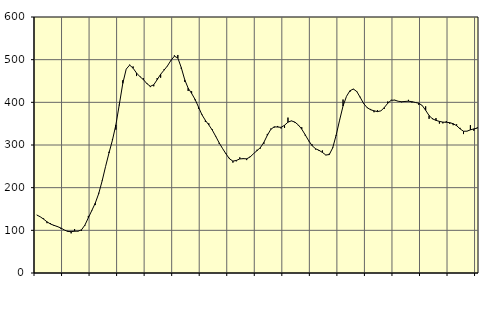
| Category | Piggar | Series 1 |
|---|---|---|
| nan | 136.1 | 135.94 |
| 87.0 | 131.9 | 131.87 |
| 87.0 | 127.9 | 126.28 |
| 87.0 | 116.8 | 119.91 |
| nan | 116.7 | 114.82 |
| 88.0 | 110.3 | 111.72 |
| 88.0 | 110.1 | 108.84 |
| 88.0 | 103.7 | 105.51 |
| nan | 101 | 100.97 |
| 89.0 | 98.9 | 97.38 |
| 89.0 | 92.9 | 96.98 |
| 89.0 | 103.1 | 97.82 |
| nan | 97.5 | 98.11 |
| 90.0 | 98.5 | 101.14 |
| 90.0 | 111.1 | 112.34 |
| 90.0 | 133.8 | 129.44 |
| nan | 147.4 | 146.35 |
| 91.0 | 159.2 | 163.51 |
| 91.0 | 187.8 | 185.89 |
| 91.0 | 216.3 | 215.57 |
| nan | 249.6 | 249.4 |
| 92.0 | 284.1 | 281.43 |
| 92.0 | 314 | 311.37 |
| 92.0 | 336.1 | 347.24 |
| nan | 393 | 394.89 |
| 93.0 | 451.7 | 444.25 |
| 93.0 | 477.9 | 477.86 |
| 93.0 | 488.2 | 487.33 |
| nan | 484.1 | 480.06 |
| 94.0 | 461.6 | 468.66 |
| 94.0 | 461 | 460.13 |
| 94.0 | 456.4 | 453.19 |
| nan | 445.2 | 443.91 |
| 95.0 | 435.7 | 437.53 |
| 95.0 | 437.6 | 441.12 |
| 95.0 | 457 | 453.09 |
| nan | 457.7 | 465.75 |
| 96.0 | 477.5 | 475.47 |
| 96.0 | 484.8 | 485.62 |
| 96.0 | 497.3 | 498.37 |
| nan | 510.1 | 508.2 |
| 97.0 | 511 | 503.9 |
| 97.0 | 478.4 | 481.43 |
| 97.0 | 448.1 | 452.93 |
| nan | 426.6 | 433.16 |
| 98.0 | 426 | 420.98 |
| 98.0 | 405 | 407.01 |
| 98.0 | 384.9 | 389.13 |
| nan | 372.1 | 370.88 |
| 99.0 | 354.1 | 357.81 |
| 99.0 | 350.8 | 347.02 |
| 99.0 | 336.7 | 335.11 |
| nan | 319.5 | 320.44 |
| 0.0 | 303 | 305.16 |
| 0.0 | 291.4 | 291.72 |
| 0.0 | 280.2 | 279.05 |
| nan | 269.7 | 267.75 |
| 1.0 | 258.7 | 262.21 |
| 1.0 | 261.8 | 263.77 |
| 1.0 | 271 | 267.39 |
| nan | 269.2 | 267.92 |
| 2.0 | 264.6 | 267.63 |
| 2.0 | 272.9 | 271.91 |
| 2.0 | 279.9 | 279.7 |
| nan | 288.9 | 286.79 |
| 3.0 | 291.8 | 294.08 |
| 3.0 | 302.7 | 306.22 |
| 3.0 | 326 | 322.69 |
| nan | 338.5 | 336.52 |
| 4.0 | 340.8 | 342.62 |
| 4.0 | 344.6 | 342.11 |
| 4.0 | 338.5 | 341.41 |
| nan | 340.1 | 346.24 |
| 5.0 | 364.2 | 353.54 |
| 5.0 | 356.1 | 356.57 |
| 5.0 | 352.3 | 353.71 |
| nan | 346.1 | 347.05 |
| 6.0 | 341.8 | 337.18 |
| 6.0 | 322.2 | 324.04 |
| 6.0 | 309 | 310.2 |
| nan | 301.6 | 298.57 |
| 7.0 | 289.6 | 291.31 |
| 7.0 | 286 | 287.56 |
| 7.0 | 287.3 | 282.61 |
| nan | 276.1 | 276.56 |
| 8.0 | 279.6 | 277.56 |
| 8.0 | 294.6 | 293.38 |
| 8.0 | 321.8 | 323.25 |
| nan | 358.8 | 358.15 |
| 9.0 | 406.6 | 391.38 |
| 9.0 | 414 | 414.07 |
| 9.0 | 424.4 | 427.14 |
| nan | 430.5 | 431.28 |
| 10.0 | 426.2 | 425.28 |
| 10.0 | 412.9 | 411.47 |
| 10.0 | 396.1 | 397.08 |
| nan | 386.6 | 387.58 |
| 11.0 | 384.5 | 382.69 |
| 11.0 | 376.8 | 380.12 |
| 11.0 | 381.6 | 378.28 |
| nan | 380 | 380.03 |
| 12.0 | 384.9 | 387.84 |
| 12.0 | 402 | 397.99 |
| 12.0 | 405.8 | 404.79 |
| nan | 405.7 | 405.19 |
| 13.0 | 402.7 | 402.55 |
| 13.0 | 400.2 | 401.41 |
| 13.0 | 401.5 | 402.03 |
| nan | 405.8 | 402.6 |
| 14.0 | 399.6 | 401.61 |
| 14.0 | 399.3 | 399.71 |
| 14.0 | 394.1 | 397.99 |
| nan | 393 | 392.52 |
| 15.0 | 390.6 | 381.35 |
| 15.0 | 361.3 | 369.02 |
| 15.0 | 362.7 | 361.17 |
| nan | 363.1 | 357.75 |
| 16.0 | 350.1 | 355.32 |
| 16.0 | 350.7 | 353.62 |
| 16.0 | 356.1 | 353.19 |
| nan | 349.6 | 352.34 |
| 17.0 | 346.4 | 349.95 |
| 17.0 | 348.6 | 345.26 |
| 17.0 | 340.2 | 337.81 |
| nan | 325.6 | 332.19 |
| 18.0 | 332.1 | 332.38 |
| 18.0 | 346.5 | 335.46 |
| 18.0 | 333.4 | 337.74 |
| nan | 341.4 | 339.44 |